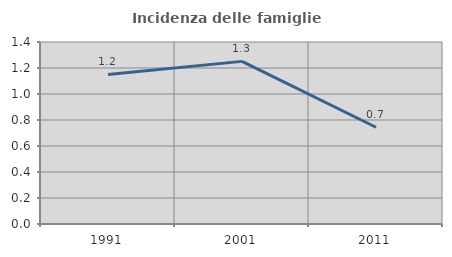
| Category | Incidenza delle famiglie numerose |
|---|---|
| 1991.0 | 1.15 |
| 2001.0 | 1.251 |
| 2011.0 | 0.744 |